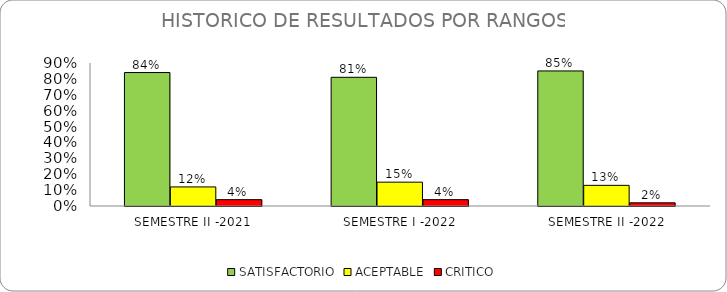
| Category | SATISFACTORIO | ACEPTABLE | CRITICO |
|---|---|---|---|
| SEMESTRE II -2021 | 0.84 | 0.12 | 0.04 |
| SEMESTRE I -2022 | 0.81 | 0.15 | 0.04 |
| SEMESTRE II -2022 | 0.85 | 0.13 | 0.02 |